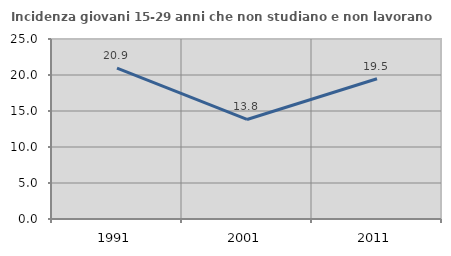
| Category | Incidenza giovani 15-29 anni che non studiano e non lavorano  |
|---|---|
| 1991.0 | 20.941 |
| 2001.0 | 13.826 |
| 2011.0 | 19.484 |